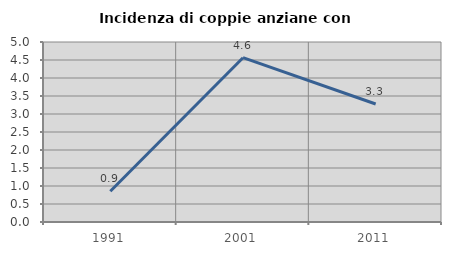
| Category | Incidenza di coppie anziane con figli |
|---|---|
| 1991.0 | 0.855 |
| 2001.0 | 4.564 |
| 2011.0 | 3.279 |